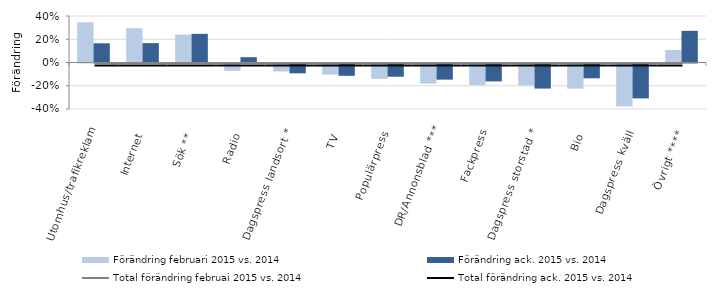
| Category | Förändring februari 2015 vs. 2014 | Förändring ack. 2015 vs. 2014 |
|---|---|---|
| Utomhus/trafikreklam | 0.346 | 0.165 |
| Internet | 0.295 | 0.167 |
| Sök ** | 0.24 | 0.247 |
| Radio | -0.063 | 0.046 |
| Dagspress landsort * | -0.068 | -0.085 |
| TV | -0.095 | -0.106 |
| Populärpress | -0.133 | -0.114 |
| DR/Annonsblad *** | -0.173 | -0.139 |
| Fackpress | -0.185 | -0.154 |
| Dagspress storstad * | -0.187 | -0.216 |
| Bio | -0.217 | -0.128 |
| Dagspress kväll | -0.37 | -0.3 |
| Övrigt **** | 0.108 | 0.272 |